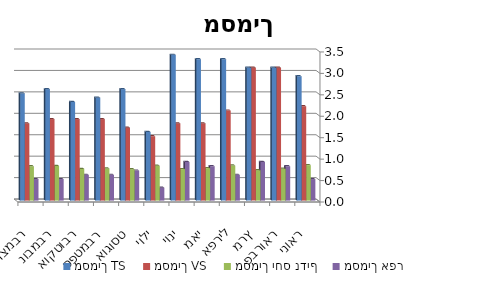
| Category | מסמיך TS | מסמיך VS | מסמיך יחס נדיף | מסמיך אפר |
|---|---|---|---|---|
| ינואר | 2.9 | 2.2 | 0.828 | 0.5 |
| פברואר | 3.1 | 3.1 | 0.742 | 0.8 |
| מרץ | 3.1 | 3.1 | 0.71 | 0.9 |
| אפריל | 3.3 | 2.1 | 0.818 | 0.6 |
| מאי | 3.3 | 1.8 | 0.758 | 0.8 |
| יוני | 3.4 | 1.8 | 0.735 | 0.9 |
| יולי | 1.6 | 1.5 | 0.812 | 0.3 |
| אוגוסט | 2.6 | 1.7 | 0.731 | 0.7 |
| ספטמבר | 2.4 | 1.9 | 0.75 | 0.6 |
| אוקטובר | 2.3 | 1.9 | 0.739 | 0.6 |
| נובמבר | 2.6 | 1.9 | 0.808 | 0.5 |
| דצמבר | 2.5 | 1.8 | 0.8 | 0.5 |